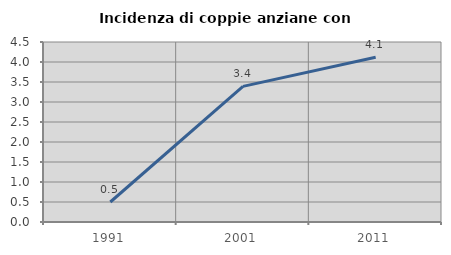
| Category | Incidenza di coppie anziane con figli |
|---|---|
| 1991.0 | 0.5 |
| 2001.0 | 3.39 |
| 2011.0 | 4.118 |